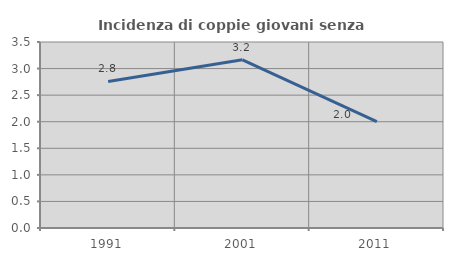
| Category | Incidenza di coppie giovani senza figli |
|---|---|
| 1991.0 | 2.759 |
| 2001.0 | 3.165 |
| 2011.0 | 2 |